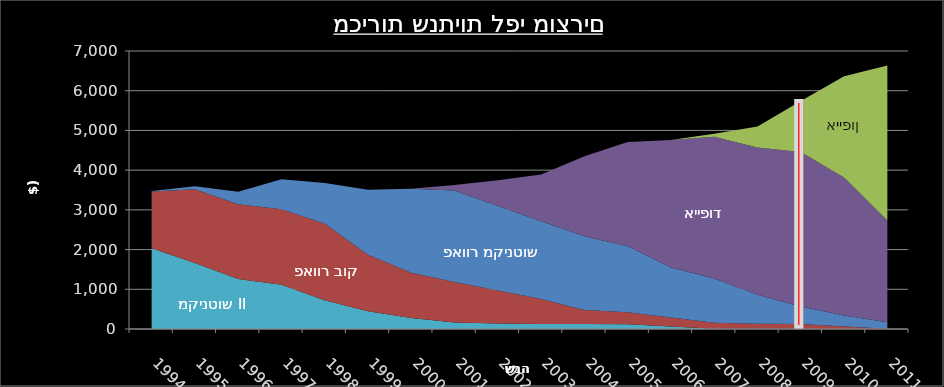
| Category | קו |
|---|---|
| 0 | 0 |
| 1 | 0 |
| 2 | 0 |
| 3 | 0 |
| 4 | 0 |
| 5 | 0 |
| 6 | 0 |
| 7 | 0 |
| 8 | 0 |
| 9 | 0 |
| 10 | 0 |
| 11 | 0 |
| 12 | 0 |
| 13 | 0 |
| 14 | 0 |
| 15 | 5742.15 |
| 16 | 0 |
| 17 | 0 |